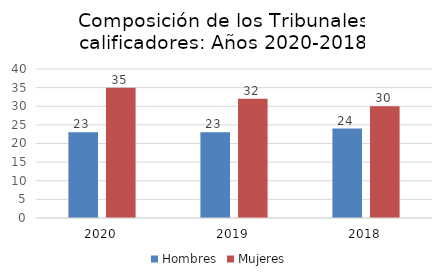
| Category | Hombres | Mujeres |
|---|---|---|
| 0 | 23 | 35 |
| 1 | 23 | 32 |
| 2 | 24 | 30 |